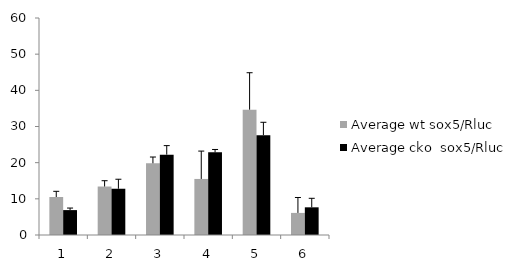
| Category | Average wt sox5/Rluc | Average cko  sox5/Rluc |
|---|---|---|
| 0 | 10.502 | 6.884 |
| 1 | 13.404 | 12.79 |
| 2 | 19.827 | 22.211 |
| 3 | 15.5 | 22.848 |
| 4 | 34.66 | 27.615 |
| 5 | 6.108 | 7.652 |